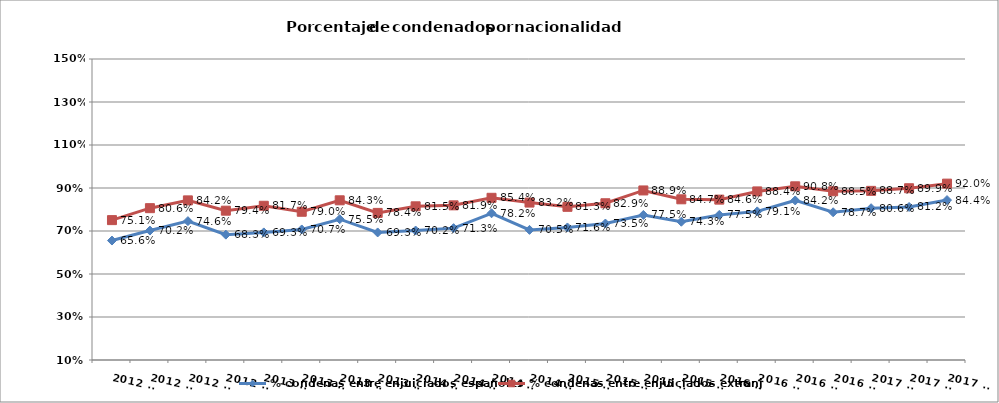
| Category | % condenas entre enjuiciados españoles | % condenas entre enjuiciados extranjeros |
|---|---|---|
| 2012 T1 | 0.656 | 0.751 |
| 2012 T2 | 0.702 | 0.806 |
| 2012 T3 | 0.746 | 0.842 |
| 2012 T4 | 0.683 | 0.794 |
| 2013 T1 | 0.693 | 0.817 |
| 2013 T2 | 0.707 | 0.79 |
| 2013 T3 | 0.755 | 0.843 |
| 2013 T4 | 0.693 | 0.784 |
| 2014 T1 | 0.702 | 0.815 |
| 2014 T2 | 0.713 | 0.819 |
| 2014 T3 | 0.782 | 0.854 |
| 2014 T4 | 0.705 | 0.832 |
| 2015 T1 | 0.716 | 0.812 |
| 2015 T2 | 0.735 | 0.829 |
| 2015 T3 | 0.775 | 0.889 |
| 2015 T4 | 0.743 | 0.847 |
| 2016 T1 | 0.775 | 0.846 |
| 2016 T2 | 0.791 | 0.884 |
| 2016 T3 | 0.842 | 0.908 |
| 2016 T4 | 0.787 | 0.885 |
| 2017 T1 | 0.806 | 0.887 |
| 2017 T2 | 0.812 | 0.899 |
| 2017 T3 | 0.844 | 0.92 |